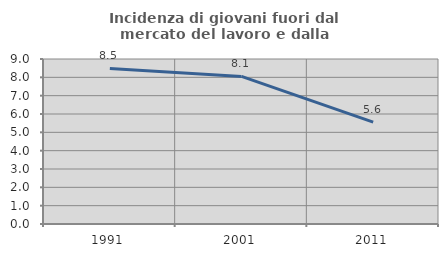
| Category | Incidenza di giovani fuori dal mercato del lavoro e dalla formazione  |
|---|---|
| 1991.0 | 8.482 |
| 2001.0 | 8.051 |
| 2011.0 | 5.556 |